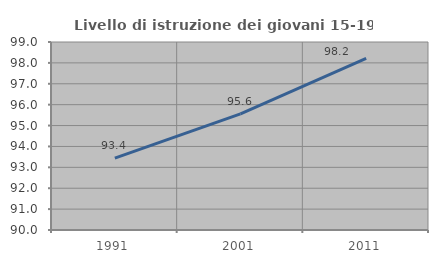
| Category | Livello di istruzione dei giovani 15-19 anni |
|---|---|
| 1991.0 | 93.443 |
| 2001.0 | 95.556 |
| 2011.0 | 98.214 |